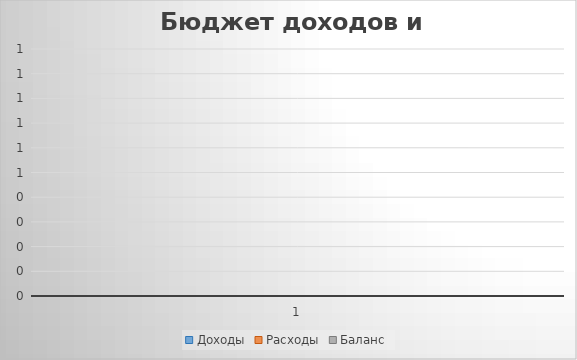
| Category | Доходы | Расходы | Баланс |
|---|---|---|---|
| 0 | 0 | 0 | 0 |